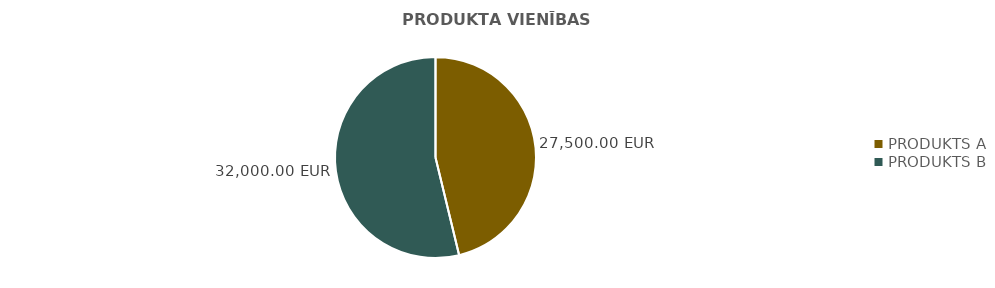
| Category | PRODUKTA VIENĪBAS IZMAKSAS |
|---|---|
| PRODUKTS A | 27500 |
| PRODUKTS B | 32000 |